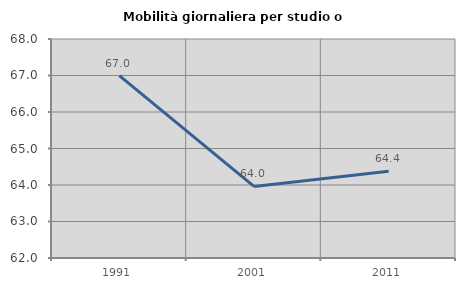
| Category | Mobilità giornaliera per studio o lavoro |
|---|---|
| 1991.0 | 66.996 |
| 2001.0 | 63.961 |
| 2011.0 | 64.376 |